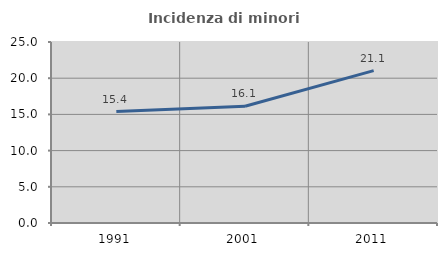
| Category | Incidenza di minori stranieri |
|---|---|
| 1991.0 | 15.385 |
| 2001.0 | 16.129 |
| 2011.0 | 21.053 |